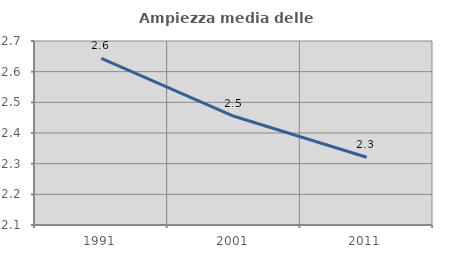
| Category | Ampiezza media delle famiglie |
|---|---|
| 1991.0 | 2.644 |
| 2001.0 | 2.454 |
| 2011.0 | 2.321 |